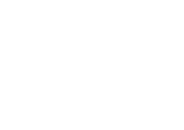
| Category | Total |
|---|---|
| 0.0 | 0 |
| 0.0 | 0 |
| 0.0 | 0 |
| 0.0 | 0 |
| 0.0 | 0 |
| 0.0 | 0 |